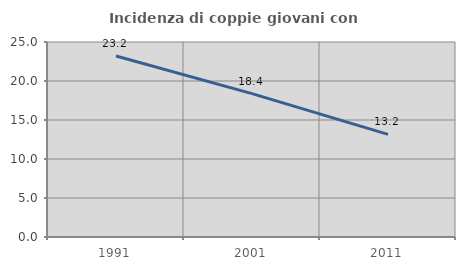
| Category | Incidenza di coppie giovani con figli |
|---|---|
| 1991.0 | 23.208 |
| 2001.0 | 18.383 |
| 2011.0 | 13.151 |